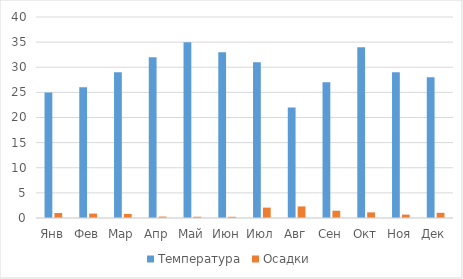
| Category | Температура | Осадки |
|---|---|---|
| Янв | 25 | 0.99 |
| Фев | 26 | 0.88 |
| Мар | 29 | 0.81 |
| Апр | 32 | 0.28 |
| Май | 35 | 0.25 |
| Июн | 33 | 0.24 |
| Июл | 31 | 2.07 |
| Авг | 22 | 2.3 |
| Сен | 27 | 1.45 |
| Окт | 34 | 1.12 |
| Ноя | 29 | 0.67 |
| Дек | 28 | 1.03 |